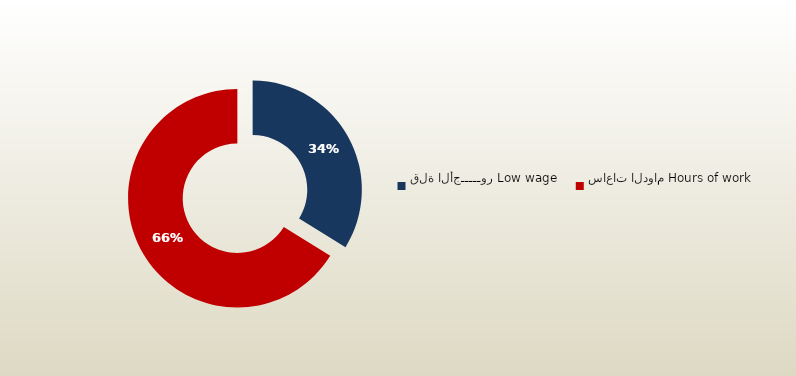
| Category | المجموع
Total |
|---|---|
| قلة الأجـــــور Low wage | 68 |
| ساعات الدوام Hours of work | 133 |